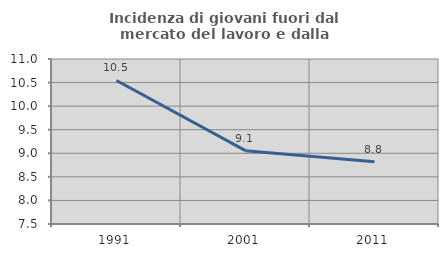
| Category | Incidenza di giovani fuori dal mercato del lavoro e dalla formazione  |
|---|---|
| 1991.0 | 10.545 |
| 2001.0 | 9.056 |
| 2011.0 | 8.819 |